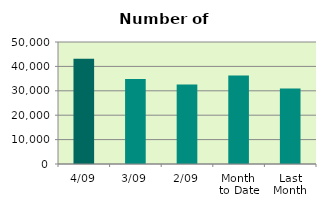
| Category | Series 0 |
|---|---|
| 4/09 | 43174 |
| 3/09 | 34866 |
| 2/09 | 32560 |
| Month 
to Date | 36281 |
| Last
Month | 30949.143 |